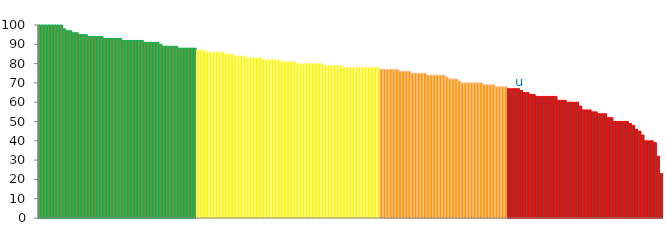
| Category | Top Quartile | 2nd Quartile | 3rd Quartile | Bottom Quartile | Series 4 |
|---|---|---|---|---|---|
|  | 100 | 0 | 0 | 0 | 100 |
|  | 100 | 0 | 0 | 0 | 100 |
|  | 100 | 0 | 0 | 0 | 100 |
|  | 100 | 0 | 0 | 0 | 100 |
|  | 100 | 0 | 0 | 0 | 100 |
|  | 100 | 0 | 0 | 0 | 100 |
|  | 100 | 0 | 0 | 0 | 100 |
|  | 100 | 0 | 0 | 0 | 100 |
|  | 98 | 0 | 0 | 0 | 98 |
|  | 97 | 0 | 0 | 0 | 97 |
|  | 97 | 0 | 0 | 0 | 97 |
|  | 96 | 0 | 0 | 0 | 96 |
|  | 96 | 0 | 0 | 0 | 96 |
|  | 95 | 0 | 0 | 0 | 95 |
|  | 95 | 0 | 0 | 0 | 95 |
|  | 95 | 0 | 0 | 0 | 95 |
|  | 94 | 0 | 0 | 0 | 94 |
|  | 94 | 0 | 0 | 0 | 94 |
|  | 94 | 0 | 0 | 0 | 94 |
|  | 94 | 0 | 0 | 0 | 94 |
|  | 94 | 0 | 0 | 0 | 94 |
|  | 93 | 0 | 0 | 0 | 93 |
|  | 93 | 0 | 0 | 0 | 93 |
|  | 93 | 0 | 0 | 0 | 93 |
|  | 93 | 0 | 0 | 0 | 93 |
|  | 93 | 0 | 0 | 0 | 93 |
|  | 93 | 0 | 0 | 0 | 93 |
|  | 92 | 0 | 0 | 0 | 92 |
|  | 92 | 0 | 0 | 0 | 92 |
|  | 92 | 0 | 0 | 0 | 92 |
|  | 92 | 0 | 0 | 0 | 92 |
|  | 92 | 0 | 0 | 0 | 92 |
|  | 92 | 0 | 0 | 0 | 92 |
|  | 92 | 0 | 0 | 0 | 92 |
|  | 91 | 0 | 0 | 0 | 91 |
|  | 91 | 0 | 0 | 0 | 91 |
|  | 91 | 0 | 0 | 0 | 91 |
|  | 91 | 0 | 0 | 0 | 91 |
|  | 91 | 0 | 0 | 0 | 91 |
|  | 90 | 0 | 0 | 0 | 90 |
|  | 89 | 0 | 0 | 0 | 89 |
|  | 89 | 0 | 0 | 0 | 89 |
|  | 89 | 0 | 0 | 0 | 89 |
|  | 89 | 0 | 0 | 0 | 89 |
|  | 89 | 0 | 0 | 0 | 89 |
|  | 88 | 0 | 0 | 0 | 88 |
|  | 88 | 0 | 0 | 0 | 88 |
|  | 88 | 0 | 0 | 0 | 88 |
|  | 88 | 0 | 0 | 0 | 88 |
|  | 88 | 0 | 0 | 0 | 88 |
|  | 88 | 0 | 0 | 0 | 88 |
|  | 0 | 87 | 0 | 0 | 87 |
|  | 0 | 87 | 0 | 0 | 87 |
|  | 0 | 87 | 0 | 0 | 87 |
|  | 0 | 86 | 0 | 0 | 86 |
|  | 0 | 86 | 0 | 0 | 86 |
|  | 0 | 86 | 0 | 0 | 86 |
|  | 0 | 86 | 0 | 0 | 86 |
|  | 0 | 86 | 0 | 0 | 86 |
|  | 0 | 86 | 0 | 0 | 86 |
|  | 0 | 85 | 0 | 0 | 85 |
|  | 0 | 85 | 0 | 0 | 85 |
|  | 0 | 85 | 0 | 0 | 85 |
|  | 0 | 84 | 0 | 0 | 84 |
|  | 0 | 84 | 0 | 0 | 84 |
|  | 0 | 84 | 0 | 0 | 84 |
|  | 0 | 84 | 0 | 0 | 84 |
|  | 0 | 83 | 0 | 0 | 83 |
|  | 0 | 83 | 0 | 0 | 83 |
|  | 0 | 83 | 0 | 0 | 83 |
|  | 0 | 83 | 0 | 0 | 83 |
|  | 0 | 83 | 0 | 0 | 83 |
|  | 0 | 82 | 0 | 0 | 82 |
|  | 0 | 82 | 0 | 0 | 82 |
|  | 0 | 82 | 0 | 0 | 82 |
|  | 0 | 82 | 0 | 0 | 82 |
|  | 0 | 82 | 0 | 0 | 82 |
|  | 0 | 82 | 0 | 0 | 82 |
|  | 0 | 81 | 0 | 0 | 81 |
|  | 0 | 81 | 0 | 0 | 81 |
|  | 0 | 81 | 0 | 0 | 81 |
|  | 0 | 81 | 0 | 0 | 81 |
|  | 0 | 81 | 0 | 0 | 81 |
|  | 0 | 80 | 0 | 0 | 80 |
|  | 0 | 80 | 0 | 0 | 80 |
|  | 0 | 80 | 0 | 0 | 80 |
|  | 0 | 80 | 0 | 0 | 80 |
|  | 0 | 80 | 0 | 0 | 80 |
|  | 0 | 80 | 0 | 0 | 80 |
|  | 0 | 80 | 0 | 0 | 80 |
|  | 0 | 80 | 0 | 0 | 80 |
|  | 0 | 80 | 0 | 0 | 80 |
|  | 0 | 79 | 0 | 0 | 79 |
|  | 0 | 79 | 0 | 0 | 79 |
|  | 0 | 79 | 0 | 0 | 79 |
|  | 0 | 79 | 0 | 0 | 79 |
|  | 0 | 79 | 0 | 0 | 79 |
|  | 0 | 79 | 0 | 0 | 79 |
|  | 0 | 78 | 0 | 0 | 78 |
|  | 0 | 78 | 0 | 0 | 78 |
|  | 0 | 78 | 0 | 0 | 78 |
|  | 0 | 78 | 0 | 0 | 78 |
|  | 0 | 78 | 0 | 0 | 78 |
|  | 0 | 78 | 0 | 0 | 78 |
|  | 0 | 78 | 0 | 0 | 78 |
|  | 0 | 78 | 0 | 0 | 78 |
|  | 0 | 78 | 0 | 0 | 78 |
|  | 0 | 78 | 0 | 0 | 78 |
|  | 0 | 78 | 0 | 0 | 78 |
|  | 0 | 78 | 0 | 0 | 78 |
|  | 0 | 0 | 77 | 0 | 77 |
|  | 0 | 0 | 77 | 0 | 77 |
|  | 0 | 0 | 77 | 0 | 77 |
|  | 0 | 0 | 77 | 0 | 77 |
|  | 0 | 0 | 77 | 0 | 77 |
|  | 0 | 0 | 77 | 0 | 77 |
|  | 0 | 0 | 76 | 0 | 76 |
|  | 0 | 0 | 76 | 0 | 76 |
|  | 0 | 0 | 76 | 0 | 76 |
|  | 0 | 0 | 76 | 0 | 76 |
|  | 0 | 0 | 75 | 0 | 75 |
|  | 0 | 0 | 75 | 0 | 75 |
|  | 0 | 0 | 75 | 0 | 75 |
|  | 0 | 0 | 75 | 0 | 75 |
|  | 0 | 0 | 75 | 0 | 75 |
|  | 0 | 0 | 74 | 0 | 74 |
|  | 0 | 0 | 74 | 0 | 74 |
|  | 0 | 0 | 74 | 0 | 74 |
|  | 0 | 0 | 74 | 0 | 74 |
|  | 0 | 0 | 74 | 0 | 74 |
|  | 0 | 0 | 74 | 0 | 74 |
|  | 0 | 0 | 73 | 0 | 73 |
|  | 0 | 0 | 72 | 0 | 72 |
|  | 0 | 0 | 72 | 0 | 72 |
|  | 0 | 0 | 72 | 0 | 72 |
|  | 0 | 0 | 71 | 0 | 71 |
|  | 0 | 0 | 70 | 0 | 70 |
|  | 0 | 0 | 70 | 0 | 70 |
|  | 0 | 0 | 70 | 0 | 70 |
|  | 0 | 0 | 70 | 0 | 70 |
|  | 0 | 0 | 70 | 0 | 70 |
|  | 0 | 0 | 70 | 0 | 70 |
|  | 0 | 0 | 70 | 0 | 70 |
|  | 0 | 0 | 69 | 0 | 69 |
|  | 0 | 0 | 69 | 0 | 69 |
|  | 0 | 0 | 69 | 0 | 69 |
|  | 0 | 0 | 69 | 0 | 69 |
|  | 0 | 0 | 68 | 0 | 68 |
|  | 0 | 0 | 68 | 0 | 68 |
|  | 0 | 0 | 68 | 0 | 68 |
|  | 0 | 0 | 68 | 0 | 68 |
|  | 0 | 0 | 0 | 67 | 67 |
|  | 0 | 0 | 0 | 67 | 67 |
|  | 0 | 0 | 0 | 67 | 67 |
|  | 0 | 0 | 0 | 67 | 67 |
| u | 0 | 0 | 0 | 66 | 66 |